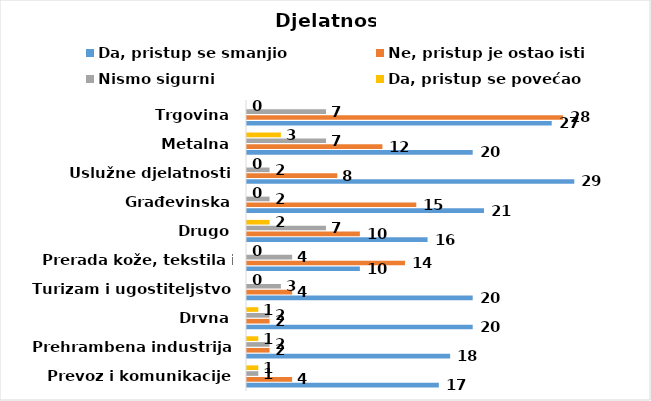
| Category | Da, pristup se smanjio | Ne, pristup je ostao isti | Nismo sigurni | Da, pristup se povećao |
|---|---|---|---|---|
| Prevoz i komunikacije | 17 | 4 | 1 | 1 |
| Prehrambena industrija | 18 | 2 | 2 | 1 |
| Drvna | 20 | 2 | 2 | 1 |
| Turizam i ugostiteljstvo | 20 | 4 | 3 | 0 |
| Prerada kože, tekstila i obuće | 10 | 14 | 4 | 0 |
| Drugo | 16 | 10 | 7 | 2 |
| Građevinska | 21 | 15 | 2 | 0 |
| Uslužne djelatnosti | 29 | 8 | 2 | 0 |
| Metalna | 20 | 12 | 7 | 3 |
| Trgovina | 27 | 28 | 7 | 0 |